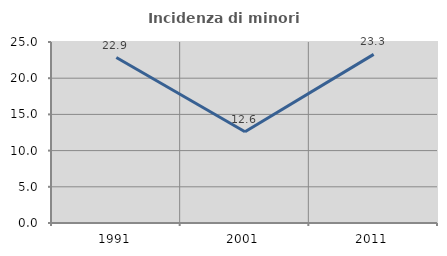
| Category | Incidenza di minori stranieri |
|---|---|
| 1991.0 | 22.857 |
| 2001.0 | 12.605 |
| 2011.0 | 23.295 |